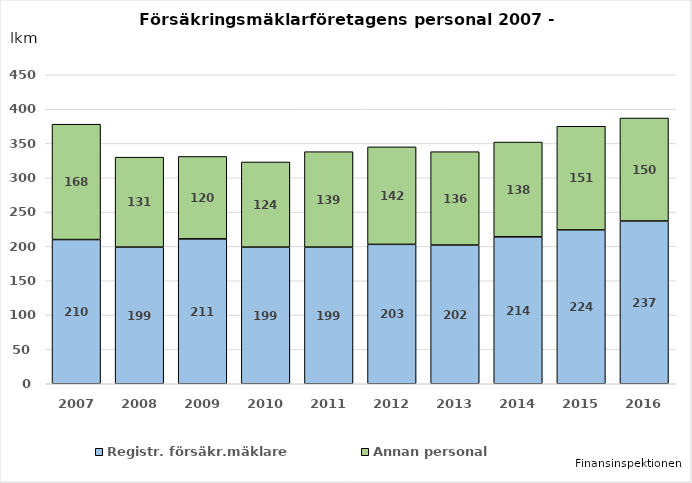
| Category | Registr. försäkr.mäklare | Annan personal |
|---|---|---|
| 2007.0 | 210 | 168 |
| 2008.0 | 199 | 131 |
| 2009.0 | 211 | 120 |
| 2010.0 | 199 | 124 |
| 2011.0 | 199 | 139 |
| 2012.0 | 203 | 142 |
| 2013.0 | 202 | 136 |
| 2014.0 | 214 | 138 |
| 2015.0 | 224 | 151 |
| 2016.0 | 237 | 150 |